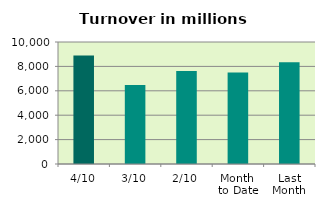
| Category | Series 0 |
|---|---|
| 4/10 | 8891.576 |
| 3/10 | 6485.653 |
| 2/10 | 7623.589 |
| Month 
to Date | 7508.848 |
| Last
Month | 8346.546 |